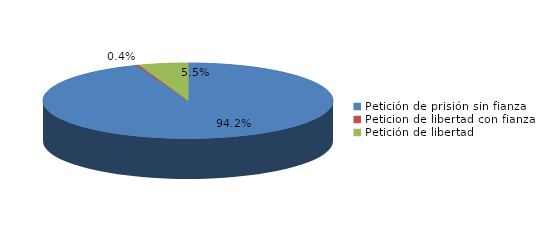
| Category | Series 0 |
|---|---|
| Petición de prisión sin fianza | 2934 |
| Peticion de libertad con fianza | 11 |
| Petición de libertad | 170 |